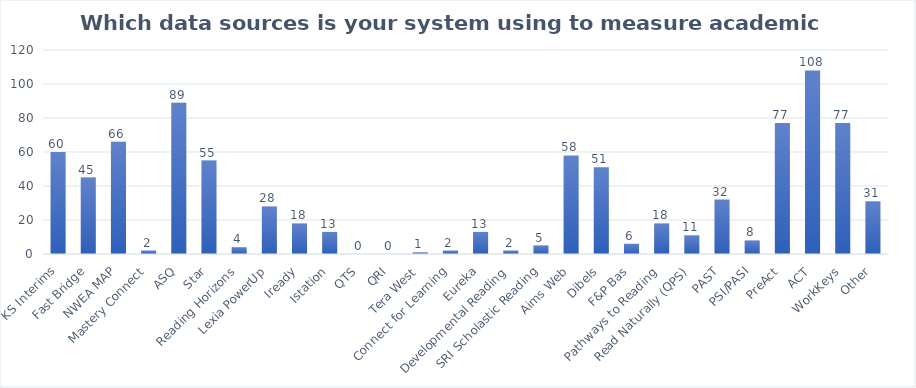
| Category | Series 0 |
|---|---|
| KS Interims | 60 |
| Fast Bridge | 45 |
| NWEA MAP | 66 |
| Mastery Connect | 2 |
| ASQ | 89 |
| Star | 55 |
| Reading Horizons | 4 |
| Lexia PowerUp | 28 |
| Iready | 18 |
| Istation | 13 |
| QTS | 0 |
| QRI | 0 |
| Tera West | 1 |
| Connect for Learning | 2 |
| Eureka | 13 |
| Developmental Reading | 2 |
| SRI Scholastic Reading | 5 |
| Aims Web | 58 |
| Dibels | 51 |
| F&P Bas | 6 |
| Pathways to Reading | 18 |
| Read Naturally (QPS) | 11 |
| PAST | 32 |
| PSI/PASI | 8 |
| PreAct | 77 |
| ACT | 108 |
| WorkKeys | 77 |
| Other | 31 |